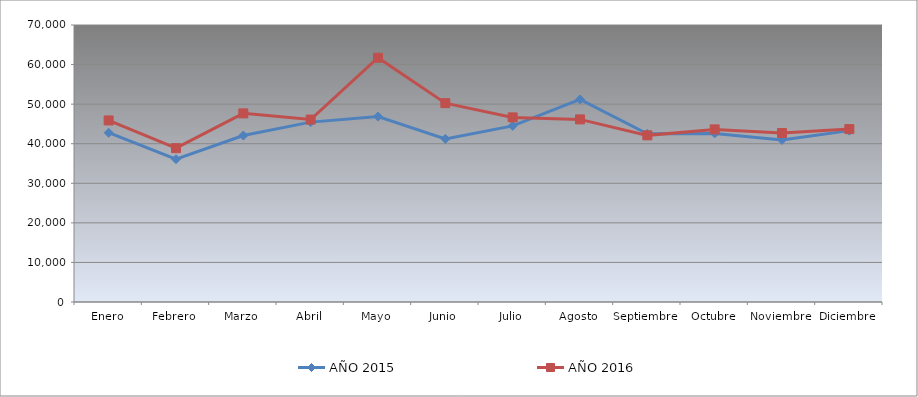
| Category | AÑO 2015 | AÑO 2016 |
|---|---|---|
| Enero | 42777.893 | 45880.903 |
| Febrero | 36076.793 | 38873.129 |
| Marzo | 42061.348 | 47665.744 |
| Abril | 45457.266 | 46107.683 |
| Mayo | 46863.67 | 61730.288 |
| Junio | 41215.371 | 50251.313 |
| Julio | 44505.875 | 46652.235 |
| Agosto | 51200.304 | 46146.88 |
| Septiembre | 42493.677 | 42111.04 |
| Octubre | 42607.097 | 43620.105 |
| Noviembre | 40957.841 | 42703.187 |
| Diciembre | 43306.295 | 43691.499 |